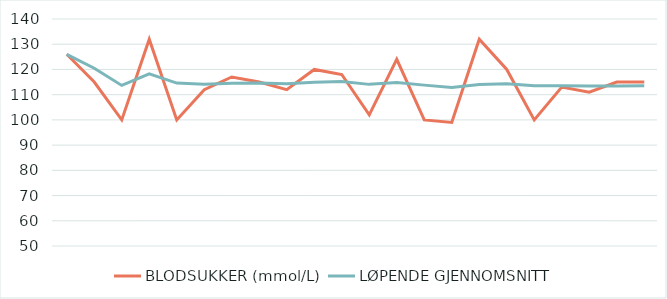
| Category | BLODSUKKER (mmol/L) | LØPENDE GJENNOMSNITT |
|---|---|---|
| 0 | 126 | 126 |
| 1 | 115 | 120.5 |
| 2 | 100 | 113.667 |
| 3 | 132 | 118.25 |
| 4 | 100 | 114.6 |
| 5 | 112 | 114.167 |
| 6 | 117 | 114.571 |
| 7 | 115 | 114.625 |
| 8 | 112 | 114.333 |
| 9 | 120 | 114.9 |
| 10 | 118 | 115.182 |
| 11 | 102 | 114.083 |
| 12 | 124 | 114.846 |
| 13 | 100 | 113.786 |
| 14 | 99 | 112.8 |
| 15 | 132 | 114 |
| 16 | 120 | 114.353 |
| 17 | 100 | 113.556 |
| 18 | 113 | 113.526 |
| 19 | 111 | 113.4 |
| 20 | 115 | 113.476 |
| 21 | 115 | 113.545 |